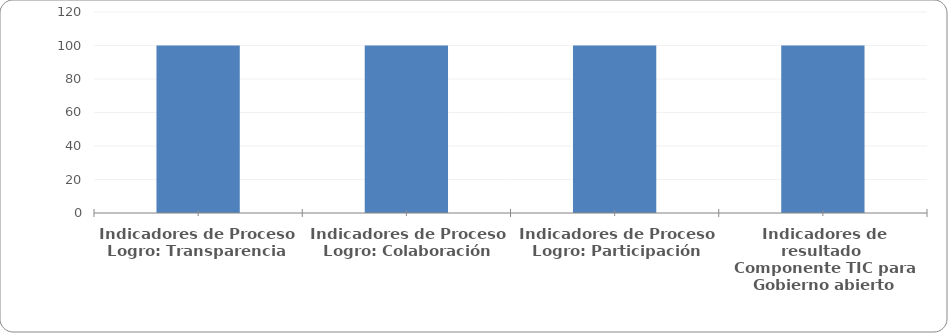
| Category | Series 0 |
|---|---|
| Indicadores de Proceso 
Logro: Transparencia  | 100 |
| Indicadores de Proceso
Logro: Colaboración | 100 |
| Indicadores de Proceso
Logro: Participación | 100 |
| Indicadores de resultado 
Componente TIC para Gobierno abierto | 100 |